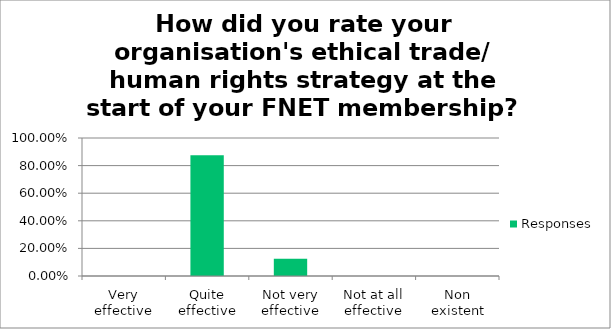
| Category | Responses |
|---|---|
| Very effective | 0 |
| Quite effective | 0.875 |
| Not very effective | 0.125 |
| Not at all effective | 0 |
| Non existent | 0 |